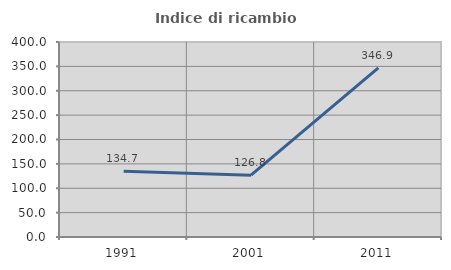
| Category | Indice di ricambio occupazionale  |
|---|---|
| 1991.0 | 134.722 |
| 2001.0 | 126.786 |
| 2011.0 | 346.875 |